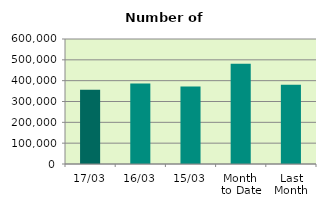
| Category | Series 0 |
|---|---|
| 17/03 | 356796 |
| 16/03 | 386042 |
| 15/03 | 372368 |
| Month 
to Date | 481440.308 |
| Last
Month | 380345.4 |